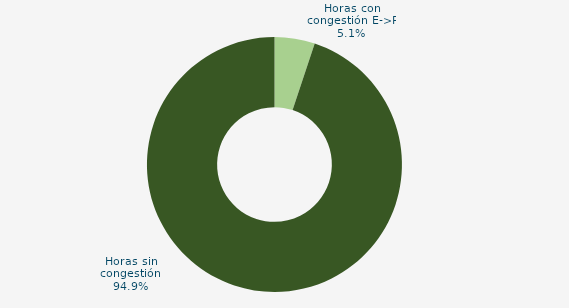
| Category | Horas con congestión E->P |
|---|---|
| Horas con congestión E->P | 5.108 |
| Horas con congestión P->E | 0 |
| Horas sin congestión | 94.892 |